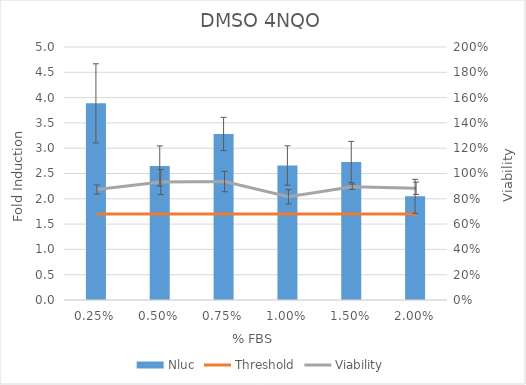
| Category | Nluc |
|---|---|
| 0.0025 | 3.886 |
| 0.005 | 2.649 |
| 0.0075 | 3.281 |
| 0.01 | 2.658 |
| 0.015 | 2.728 |
| 0.02 | 2.049 |